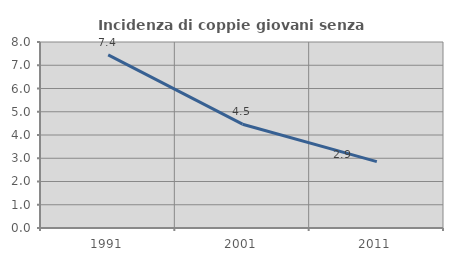
| Category | Incidenza di coppie giovani senza figli |
|---|---|
| 1991.0 | 7.447 |
| 2001.0 | 4.464 |
| 2011.0 | 2.857 |